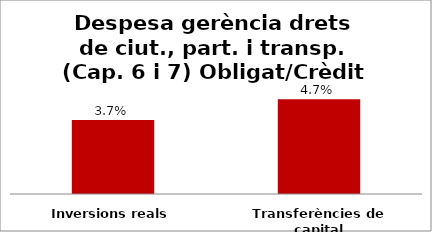
| Category | Series 0 |
|---|---|
| Inversions reals | 0.037 |
| Transferències de capital | 0.047 |